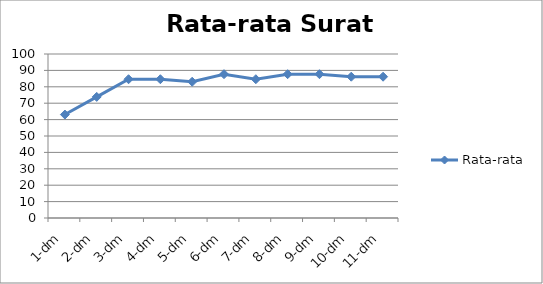
| Category | Rata-rata |
|---|---|
| 1-dm | 63.077 |
| 2-dm | 73.846 |
| 3-dm | 84.615 |
| 4-dm | 84.615 |
| 5-dm | 83.077 |
| 6-dm | 87.692 |
| 7-dm | 84.615 |
| 8-dm | 87.692 |
| 9-dm | 87.692 |
| 10-dm | 86.154 |
| 11-dm | 86.154 |